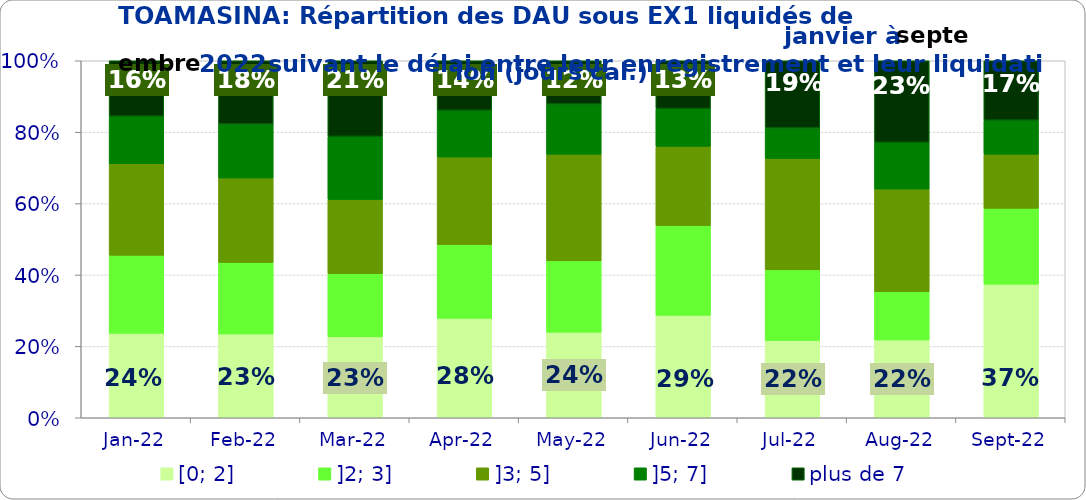
| Category | [0; 2] | ]2; 3] | ]3; 5] | ]5; 7] | plus de 7 |
|---|---|---|---|---|---|
| 2022-01-01 | 0.237 | 0.219 | 0.256 | 0.133 | 0.155 |
| 2022-02-01 | 0.235 | 0.2 | 0.236 | 0.152 | 0.177 |
| 2022-03-01 | 0.227 | 0.177 | 0.208 | 0.177 | 0.212 |
| 2022-04-01 | 0.278 | 0.207 | 0.245 | 0.131 | 0.138 |
| 2022-05-01 | 0.24 | 0.2 | 0.299 | 0.141 | 0.121 |
| 2022-06-01 | 0.287 | 0.251 | 0.222 | 0.106 | 0.134 |
| 2022-07-01 | 0.217 | 0.198 | 0.312 | 0.086 | 0.188 |
| 2022-08-01 | 0.218 | 0.135 | 0.288 | 0.131 | 0.228 |
| 2022-09-01 | 0.374 | 0.213 | 0.152 | 0.095 | 0.166 |